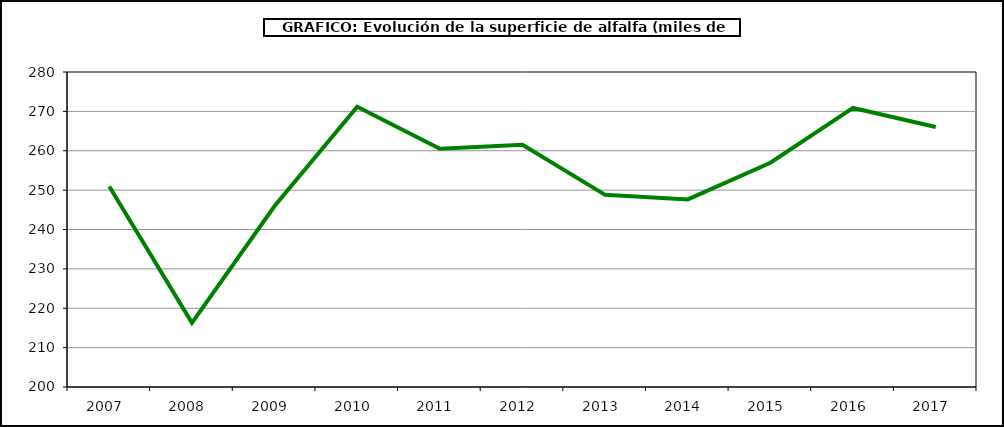
| Category | Superficie |
|---|---|
| 2007.0 | 250.925 |
| 2008.0 | 216.281 |
| 2009.0 | 245.966 |
| 2010.0 | 271.204 |
| 2011.0 | 260.531 |
| 2012.0 | 261.526 |
| 2013.0 | 248.801 |
| 2014.0 | 247.639 |
| 2015.0 | 256.952 |
| 2016.0 | 270.874 |
| 2017.0 | 266.025 |